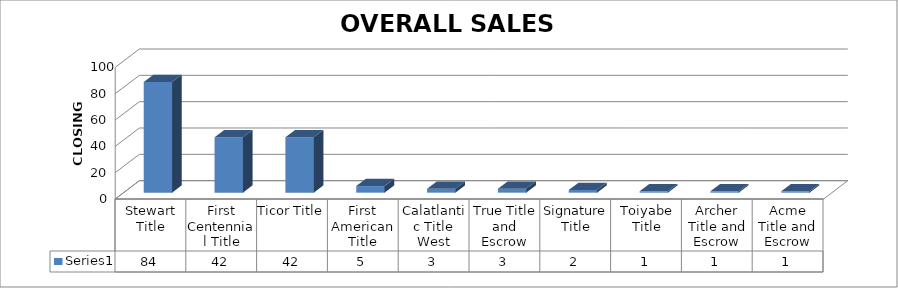
| Category | Series 0 |
|---|---|
| Stewart Title | 84 |
| First Centennial Title | 42 |
| Ticor Title | 42 |
| First American Title | 5 |
| Calatlantic Title West | 3 |
| True Title and Escrow | 3 |
| Signature Title | 2 |
| Toiyabe Title | 1 |
| Archer Title and Escrow | 1 |
| Acme Title and Escrow | 1 |